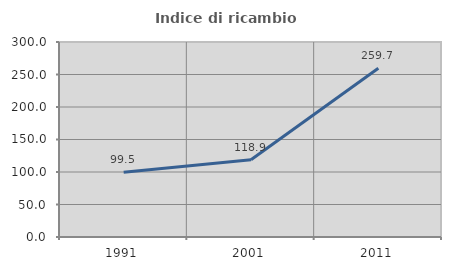
| Category | Indice di ricambio occupazionale  |
|---|---|
| 1991.0 | 99.457 |
| 2001.0 | 118.898 |
| 2011.0 | 259.729 |